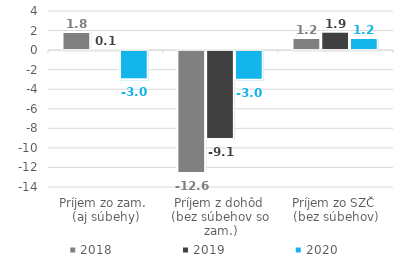
| Category | 2018 | 2019 | 2020 |
|---|---|---|---|
| Príjem zo zam. 
(aj súbehy) | 1.848 | 0.11 | -2.978 |
| Príjem z dohôd 
(bez súbehov so zam.) | -12.563 | -9.082 | -3.023 |
| Príjem zo SZČ 
(bez súbehov) | 1.24 | 1.867 | 1.242 |